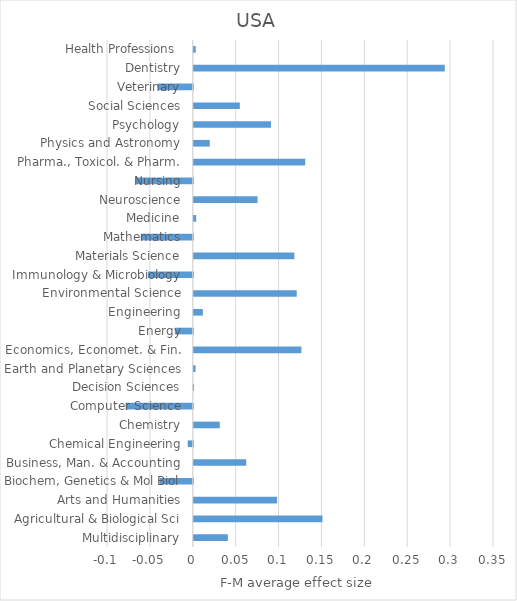
| Category | F-M average effect size |
|---|---|
| Multidisciplinary | 0.04 |
| Agricultural & Biological Sci | 0.15 |
| Arts and Humanities | 0.097 |
| Biochem, Genetics & Mol Biol | -0.039 |
| Business, Man. & Accounting | 0.061 |
| Chemical Engineering | -0.006 |
| Chemistry | 0.03 |
| Computer Science | -0.078 |
| Decision Sciences | 0 |
| Earth and Planetary Sciences | 0.002 |
| Economics, Economet. & Fin. | 0.126 |
| Energy | -0.021 |
| Engineering | 0.011 |
| Environmental Science | 0.12 |
| Immunology & Microbiology | -0.052 |
| Materials Science | 0.117 |
| Mathematics | -0.061 |
| Medicine | 0.003 |
| Neuroscience | 0.074 |
| Nursing | -0.067 |
| Pharma., Toxicol. & Pharm. | 0.13 |
| Physics and Astronomy | 0.019 |
| Psychology | 0.09 |
| Social Sciences | 0.054 |
| Veterinary | -0.041 |
| Dentistry | 0.293 |
| Health Professions  | 0.002 |